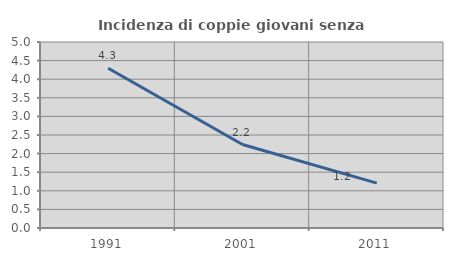
| Category | Incidenza di coppie giovani senza figli |
|---|---|
| 1991.0 | 4.294 |
| 2001.0 | 2.244 |
| 2011.0 | 1.205 |